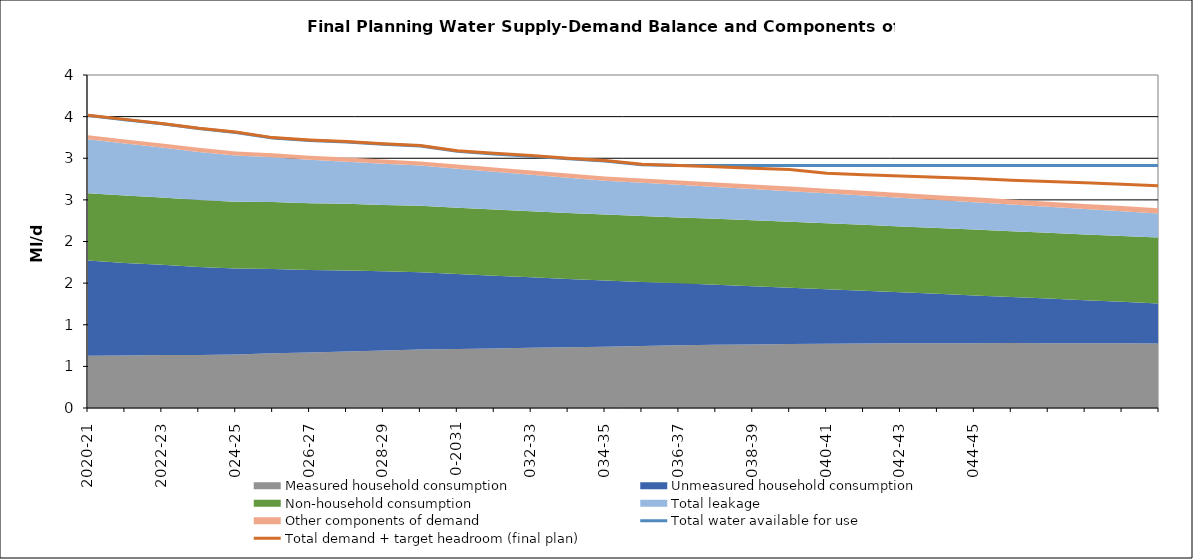
| Category | Total water available for use | Total demand + target headroom (final plan) |
|---|---|---|
| 2020-21 | 3.514 | 3.517 |
| 2021-22 | 3.463 | 3.467 |
| 2022-23 | 3.413 | 3.418 |
| 2023-24 | 3.356 | 3.361 |
| 2024-25 | 3.311 | 3.316 |
| 2025-26 | 3.243 | 3.248 |
| 2026-27 | 3.213 | 3.219 |
| 2027-28 | 3.194 | 3.201 |
| 2028-29 | 3.168 | 3.175 |
| 2029-30 | 3.146 | 3.154 |
| 2030-31 | 3.083 | 3.09 |
| 2031-32 | 3.052 | 3.059 |
| 2032-33 | 3.024 | 3.032 |
| 2033-34 | 2.993 | 3 |
| 2034-35 | 2.967 | 2.974 |
| 2035-36 | 2.922 | 2.929 |
| 2036-37 | 2.912 | 2.912 |
| 2037-38 | 2.912 | 2.897 |
| 2038-39 | 2.912 | 2.881 |
| 2039-40 | 2.912 | 2.865 |
| 2040-41 | 2.912 | 2.821 |
| 2041-42 | 2.912 | 2.803 |
| 2042-43 | 2.912 | 2.787 |
| 2043-44 | 2.912 | 2.773 |
| 2044-45 | 2.912 | 2.755 |
| 2045-46 | 2.912 | 2.736 |
| 2046-47 | 2.912 | 2.722 |
| 2047-48 | 2.912 | 2.704 |
| 2048-49 | 2.912 | 2.688 |
| 2049-50 | 2.912 | 2.67 |